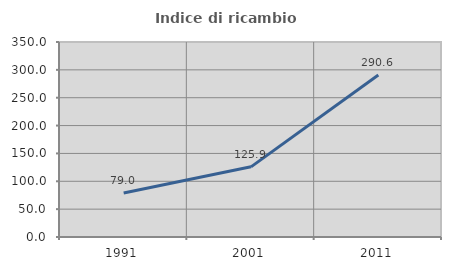
| Category | Indice di ricambio occupazionale  |
|---|---|
| 1991.0 | 79.001 |
| 2001.0 | 125.922 |
| 2011.0 | 290.64 |